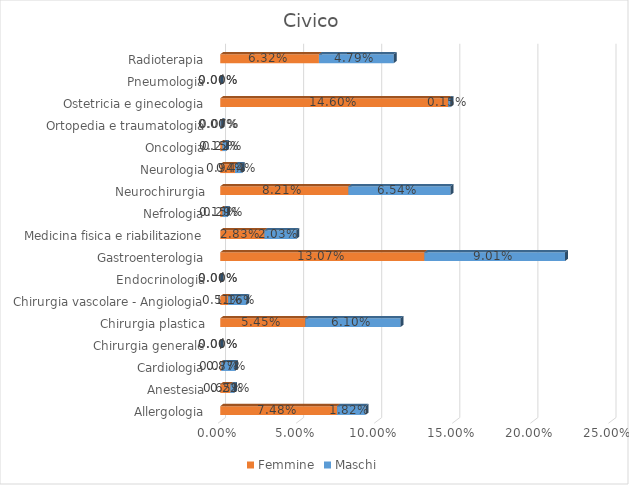
| Category | Femmine | Maschi |
|---|---|---|
| Allergologia | 0.075 | 0.018 |
| Anestesia | 0.007 | 0.002 |
| Cardiologia | 0.001 | 0.009 |
| Chirurgia generale | 0 | 0 |
| Chirurgia plastica | 0.054 | 0.061 |
| Chirurgia vascolare - Angiologia | 0.005 | 0.012 |
| Endocrinologia | 0 | 0 |
| Gastroenterologia | 0.131 | 0.09 |
| Medicina fisica e riabilitazione | 0.028 | 0.02 |
| Nefrologia | 0.001 | 0.003 |
| Neurochirurgia | 0.082 | 0.065 |
| Neurologia | 0.009 | 0.004 |
| Oncologia | 0.001 | 0.002 |
| Ortopedia e traumatologia | 0 | 0.001 |
| Ostetricia e ginecologia | 0.146 | 0.001 |
| Pneumologia | 0 | 0 |
| Radioterapia | 0.063 | 0.048 |